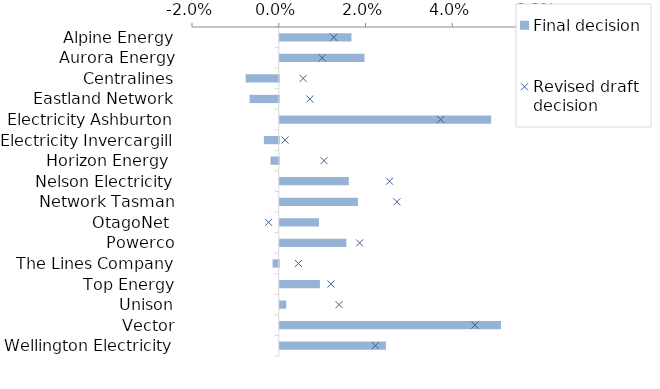
| Category | Final decision |
|---|---|
| Alpine Energy | 0.017 |
| Aurora Energy | 0.02 |
| Centralines | -0.008 |
| Eastland Network | -0.007 |
| Electricity Ashburton | 0.049 |
| Electricity Invercargill | -0.003 |
| Horizon Energy  | -0.002 |
| Nelson Electricity | 0.016 |
| Network Tasman | 0.018 |
| OtagoNet  | 0.009 |
| Powerco | 0.015 |
| The Lines Company | -0.001 |
| Top Energy | 0.009 |
| Unison | 0.001 |
| Vector | 0.051 |
| Wellington Electricity | 0.024 |